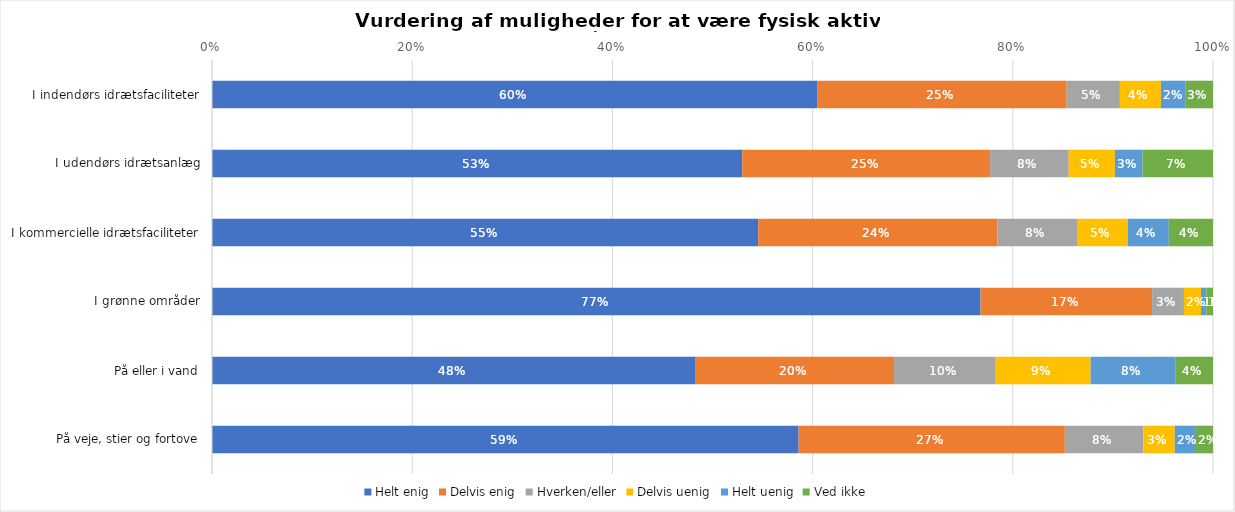
| Category | Helt enig | Delvis enig | Hverken/eller | Delvis uenig | Helt uenig | Ved ikke |
|---|---|---|---|---|---|---|
| I indendørs idrætsfaciliteter | 0.604 | 0.249 | 0.053 | 0.041 | 0.024 | 0.028 |
| I udendørs idrætsanlæg | 0.53 | 0.248 | 0.078 | 0.046 | 0.028 | 0.07 |
| I kommercielle idrætsfaciliteter | 0.546 | 0.239 | 0.08 | 0.051 | 0.041 | 0.044 |
| I grønne områder | 0.768 | 0.171 | 0.032 | 0.017 | 0.005 | 0.007 |
| På eller i vand | 0.483 | 0.198 | 0.102 | 0.095 | 0.085 | 0.038 |
| På veje, stier og fortove | 0.586 | 0.266 | 0.078 | 0.031 | 0.021 | 0.017 |